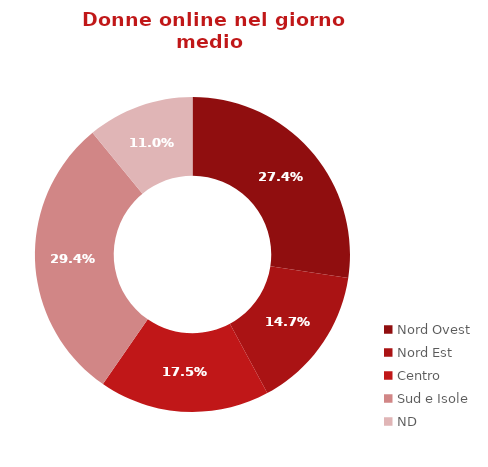
| Category | Series 0 |
|---|---|
| Nord Ovest | 0.274 |
| Nord Est | 0.147 |
| Centro | 0.175 |
| Sud e Isole | 0.294 |
| ND | 0.11 |